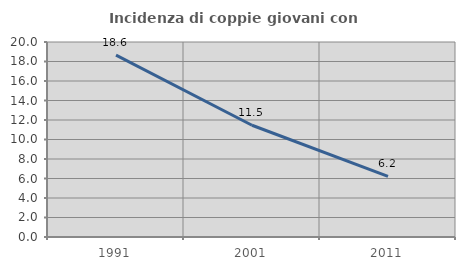
| Category | Incidenza di coppie giovani con figli |
|---|---|
| 1991.0 | 18.649 |
| 2001.0 | 11.459 |
| 2011.0 | 6.211 |